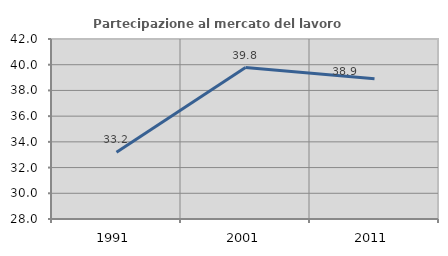
| Category | Partecipazione al mercato del lavoro  femminile |
|---|---|
| 1991.0 | 33.191 |
| 2001.0 | 39.775 |
| 2011.0 | 38.901 |